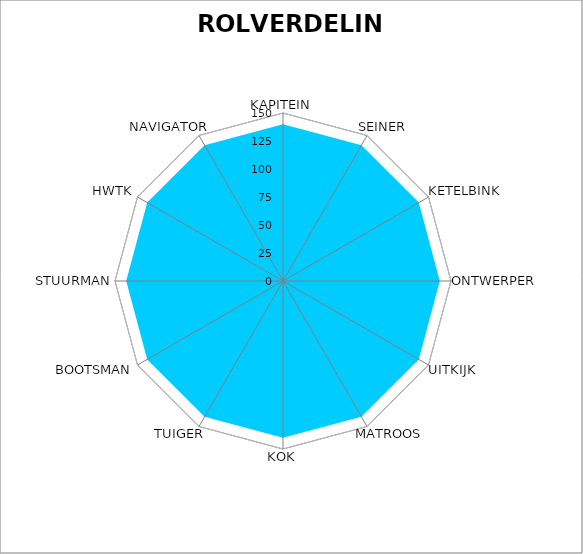
| Category | ROLVERDELING |
|---|---|
| 0 | 140 |
| 1 | 140 |
| 2 | 140 |
| 3 | 140 |
| 4 | 140 |
| 5 | 140 |
| 6 | 140 |
| 7 | 140 |
| 8 | 140 |
| 9 | 140 |
| 10 | 140 |
| 11 | 140 |